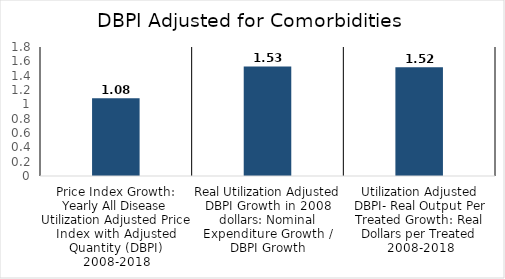
| Category | All Disease |
|---|---|
| Price Index Growth: Yearly All Disease Utilization Adjusted Price Index with Adjusted Quantity (DBPI) 2008-2018 | 1.084 |
| Real Utilization Adjusted DBPI Growth in 2008 dollars: Nominal Expenditure Growth / DBPI Growth | 1.529 |
| Utilization Adjusted DBPI- Real Output Per Treated Growth: Real Dollars per Treated 2008-2018 | 1.517 |